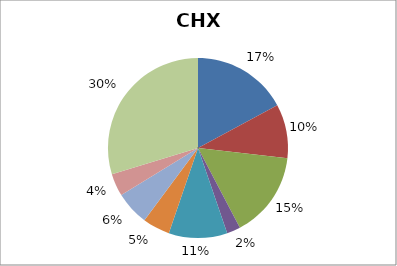
| Category | Series 0 |
|---|---|
| protein metabolism | 287 |
| misc | 162 |
| RNA | 259 |
| DNA | 41 |
| metabolism | 176 |
| signalling | 82 |
| cell division and development | 102 |
| stress | 68 |
| not assigned | 497 |